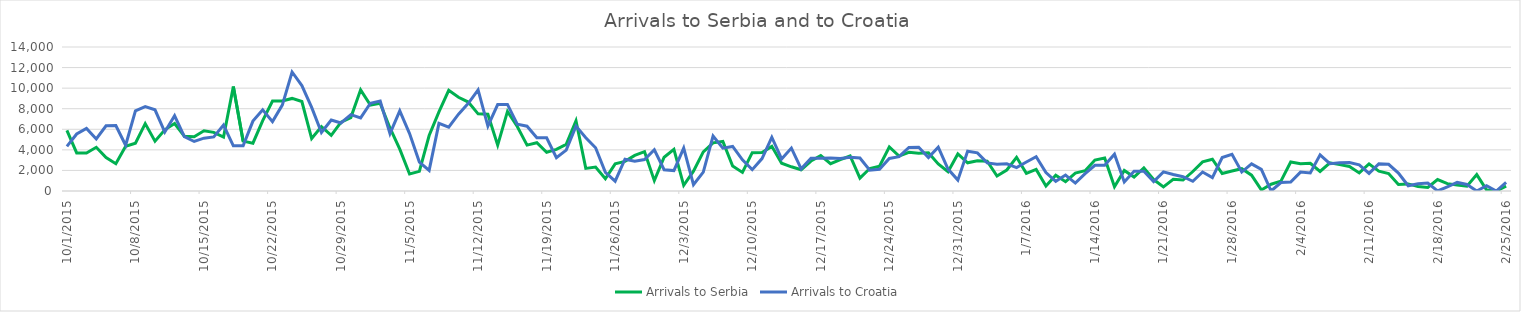
| Category | Arrivals to Serbia | Arrivals to Croatia |
|---|---|---|
| 10/1/15 | 5900 | 4344 |
| 10/2/15 | 3700 | 5546 |
| 10/3/15 | 3700 | 6086 |
| 10/4/15 | 4250 | 5065 |
| 10/5/15 | 3250 | 6338 |
| 10/6/15 | 2650 | 6370 |
| 10/7/15 | 4350 | 4446 |
| 10/8/15 | 4650 | 7798 |
| 10/9/15 | 6550 | 8201 |
| 10/10/15 | 4850 | 7896 |
| 10/11/15 | 5950 | 5732 |
| 10/12/15 | 6556 | 7317 |
| 10/13/15 | 5330 | 5286 |
| 10/14/15 | 5280 | 4814 |
| 10/15/15 | 5850 | 5138 |
| 10/16/15 | 5700 | 5260 |
| 10/17/15 | 5250 | 6415 |
| 10/18/15 | 10150 | 4390 |
| 10/19/15 | 4850 | 4388 |
| 10/20/15 | 4650 | 6793 |
| 10/21/15 | 6850 | 7900 |
| 10/22/15 | 8750 | 6748 |
| 10/23/15 | 8750 | 8348 |
| 10/24/15 | 9000 | 11570 |
| 10/25/15 | 8700 | 10249 |
| 10/26/15 | 5100 | 8128 |
| 10/27/15 | 6257 | 5683 |
| 10/28/15 | 5415 | 6900 |
| 10/29/15 | 6700 | 6615 |
| 10/30/15 | 7138 | 7429 |
| 10/31/15 | 9834 | 7110 |
| 11/1/15 | 8354 | 8534 |
| 11/2/15 | 8521 | 8746 |
| 11/3/15 | 6129 | 5573 |
| 11/4/15 | 4073 | 7792 |
| 11/5/15 | 1652 | 5587 |
| 11/6/15 | 1906 | 2809 |
| 11/7/15 | 5397 | 2000 |
| 11/8/15 | 7695 | 6579 |
| 11/9/15 | 9785 | 6214 |
| 11/10/15 | 9107 | 7474 |
| 11/11/15 | 8648 | 8524 |
| 11/12/15 | 7500 | 9823 |
| 11/13/15 | 7464 | 6314 |
| 11/14/15 | 4453 | 8405 |
| 11/15/15 | 7734 | 8415 |
| 11/16/15 | 6267 | 6490 |
| 11/17/15 | 4460 | 6304 |
| 11/18/15 | 4694 | 5180 |
| 11/19/15 | 3765 | 5167 |
| 11/20/15 | 4042 | 3230 |
| 11/21/15 | 4527 | 3977 |
| 11/22/15 | 6826 | 6305 |
| 11/23/15 | 2201 | 5184 |
| 11/24/15 | 2335 | 4203 |
| 11/25/15 | 1194 | 1808 |
| 11/26/15 | 2636 | 952 |
| 11/27/15 | 2878 | 3095 |
| 11/28/15 | 3454 | 2886 |
| 11/29/15 | 3825 | 3060 |
| 11/30/15 | 1009 | 4009 |
| 12/1/15 | 3284 | 2066 |
| 12/2/15 | 4040 | 1982 |
| 12/3/15 | 553 | 4174 |
| 12/4/15 | 1927 | 611 |
| 12/5/15 | 3799 | 1835 |
| 12/6/15 | 4686 | 5339 |
| 12/7/15 | 4823 | 4162 |
| 12/8/15 | 2437 | 4335 |
| 12/9/15 | 1807 | 3027 |
| 12/10/15 | 3723 | 2076 |
| 12/11/15 | 3747 | 3149 |
| 12/12/15 | 4339 | 5225 |
| 12/13/15 | 2698 | 3112 |
| 12/14/15 | 2353 | 4174 |
| 12/15/15 | 2067 | 2160 |
| 12/16/15 | 2916 | 3177 |
| 12/17/15 | 3438 | 3192 |
| 12/18/15 | 2649 | 3200 |
| 12/19/15 | 3052 | 3156 |
| 12/20/15 | 3405 | 3276 |
| 12/21/15 | 1253 | 3210 |
| 12/22/15 | 2186 | 2027 |
| 12/23/15 | 2415 | 2116 |
| 12/24/15 | 4279 | 3166 |
| 12/25/15 | 3390 | 3339 |
| 12/26/15 | 3757 | 4241 |
| 12/27/15 | 3674 | 4251 |
| 12/28/15 | 3708 | 3249 |
| 12/29/15 | 2629 | 4253 |
| 12/30/15 | 1879 | 2132 |
| 12/31/15 | 3602 | 1058 |
| 1/1/16 | 2745 | 3869 |
| 1/2/16 | 2947 | 3710 |
| 1/3/16 | 2889 | 2732 |
| 1/4/16 | 1462 | 2591 |
| 1/5/16 | 2041 | 2650 |
| 1/6/16 | 3273 | 2273 |
| 1/7/16 | 1715 | 2814 |
| 1/8/16 | 2100 | 3332 |
| 1/9/16 | 489 | 1799 |
| 1/10/16 | 1538 | 942 |
| 1/11/16 | 905 | 1549 |
| 1/12/16 | 1743 | 769 |
| 1/13/16 | 1973 | 1679 |
| 1/14/16 | 3006 | 2502 |
| 1/15/16 | 3213 | 2493 |
| 1/16/16 | 415 | 3579 |
| 1/17/16 | 1995 | 878 |
| 1/18/16 | 1362 | 1930 |
| 1/19/16 | 2244 | 1917 |
| 1/20/16 | 1113 | 914 |
| 1/21/16 | 397 | 1865 |
| 1/22/16 | 1134 | 1599 |
| 1/23/16 | 1064 | 1394 |
| 1/24/16 | 1895 | 946 |
| 1/25/16 | 2827 | 1847 |
| 1/26/16 | 3091 | 1309 |
| 1/27/16 | 1695 | 3256 |
| 1/28/16 | 1940 | 3565 |
| 1/29/16 | 2167 | 1843 |
| 1/30/16 | 1540 | 2641 |
| 1/31/16 | 103 | 2098 |
| 2/1/16 | 660 | 0 |
| 2/2/16 | 966 | 822 |
| 2/3/16 | 2825 | 881 |
| 2/4/16 | 2653 | 1836 |
| 2/5/16 | 2694 | 1750 |
| 2/6/16 | 1901 | 3510 |
| 2/7/16 | 2739 | 2658 |
| 2/8/16 | 2563 | 2736 |
| 2/9/16 | 2379 | 2764 |
| 2/10/16 | 1758 | 2544 |
| 2/11/16 | 2636 | 1716 |
| 2/12/16 | 1923 | 2635 |
| 2/13/16 | 1699 | 2595 |
| 2/14/16 | 641 | 1749 |
| 2/15/16 | 691 | 512 |
| 2/16/16 | 443 | 701 |
| 2/17/16 | 345 | 769 |
| 2/18/16 | 1117 | 0 |
| 2/19/16 | 713 | 408 |
| 2/20/16 | 580 | 834 |
| 2/21/16 | 476 | 630 |
| 2/22/16 | 1595 | 0 |
| 2/23/16 | 106 | 507 |
| 2/24/16 | 1 | 0 |
| 2/25/16 | 475 | 841 |